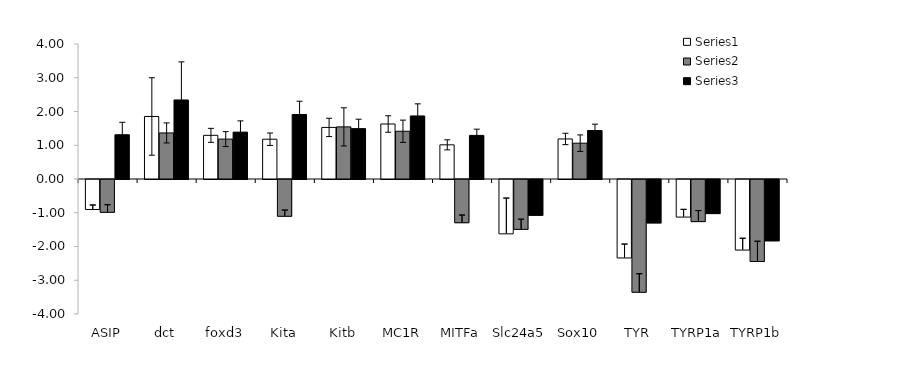
| Category | Series 0 | Series 1 | Series 2 |
|---|---|---|---|
| ASIP | -0.889 | -0.973 | 1.311 |
| dct | 1.853 | 1.365 | 2.342 |
| foxd3 | 1.294 | 1.183 | 1.389 |
| Kita | 1.178 | -1.09 | 1.911 |
| Kitb | 1.528 | 1.545 | 1.492 |
| MC1R | 1.629 | 1.414 | 1.869 |
| MITFa | 1.012 | -1.281 | 1.292 |
| Slc24a5 | -1.61 | -1.477 | -1.06 |
| Sox10 | 1.187 | 1.061 | 1.437 |
| TYR | -2.325 | -3.341 | -1.286 |
| TYRP1a | -1.114 | -1.247 | -1.009 |
| TYRP1b | -2.091 | -2.43 | -1.816 |